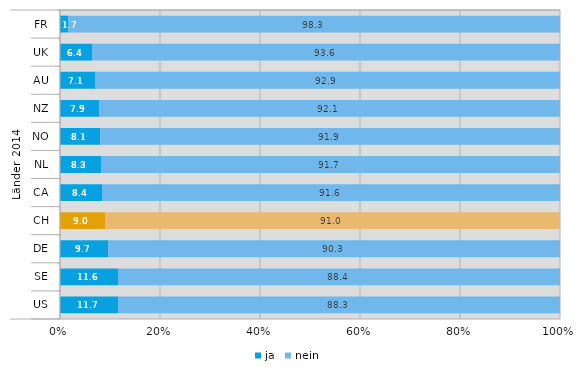
| Category | ja | nein |
|---|---|---|
| 0 | 1.7 | 98.3 |
| 1 | 6.4 | 93.6 |
| 2 | 7.1 | 92.9 |
| 3 | 7.9 | 92.1 |
| 4 | 8.1 | 91.9 |
| 5 | 8.3 | 91.7 |
| 6 | 8.4 | 91.6 |
| 7 | 9 | 91 |
| 8 | 9.7 | 90.3 |
| 9 | 11.6 | 88.4 |
| 10 | 11.7 | 88.3 |